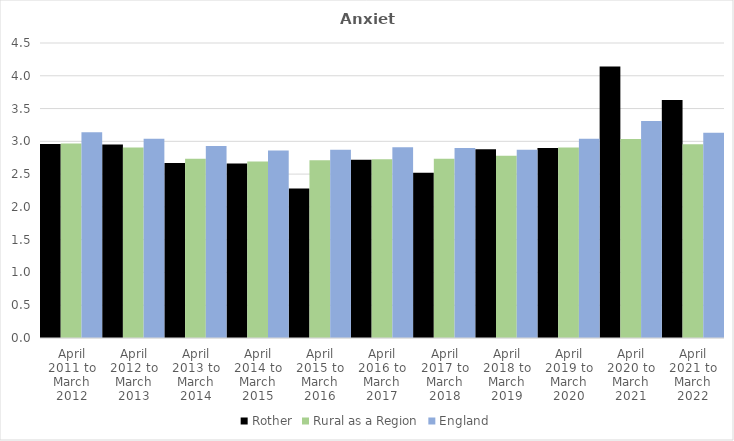
| Category | Rother | Rural as a Region | England |
|---|---|---|---|
| April 2011 to March 2012 | 2.96 | 2.967 | 3.14 |
| April 2012 to March 2013 | 2.95 | 2.904 | 3.04 |
| April 2013 to March 2014 | 2.67 | 2.734 | 2.93 |
| April 2014 to March 2015 | 2.66 | 2.691 | 2.86 |
| April 2015 to March 2016 | 2.28 | 2.711 | 2.87 |
| April 2016 to March 2017 | 2.72 | 2.729 | 2.91 |
| April 2017 to March 2018 | 2.52 | 2.736 | 2.9 |
| April 2018 to March 2019 | 2.88 | 2.78 | 2.87 |
| April 2019 to March 2020 | 2.9 | 2.908 | 3.04 |
| April 2020 to March 2021 | 4.14 | 3.036 | 3.31 |
| April 2021 to March 2022 | 3.63 | 2.956 | 3.13 |